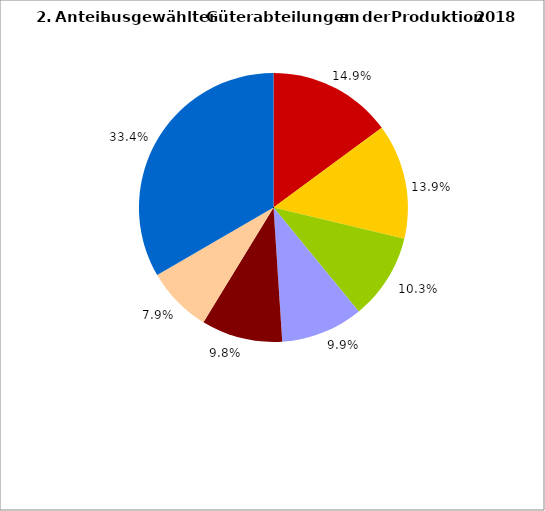
| Category | Series 0 |
|---|---|
| 0 | 14.882 |
| 1 | 13.858 |
| 2 | 10.325 |
| 3 | 9.897 |
| 4 | 9.756 |
| 5 | 7.903 |
| 6 | 33.379 |